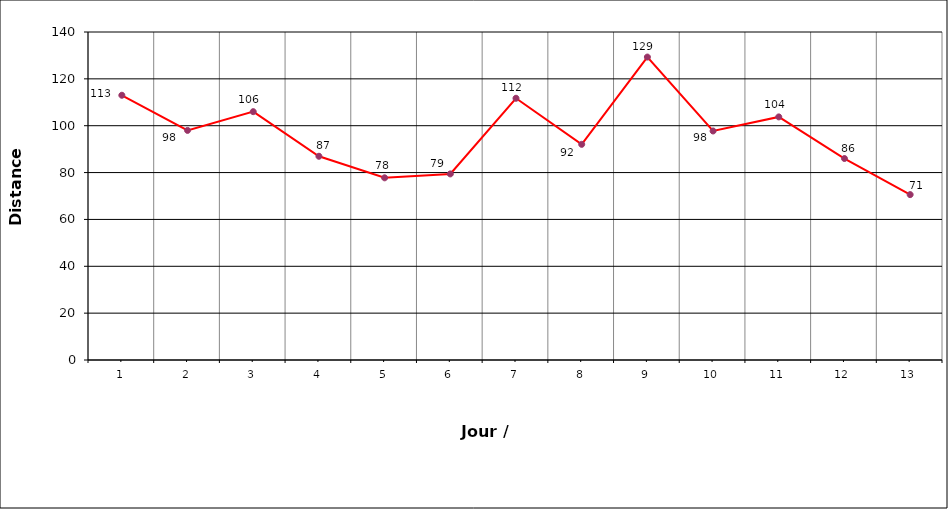
| Category | Series 1 |
|---|---|
| 0 | 113 |
| 1 | 98 |
| 2 | 106 |
| 3 | 86.96 |
| 4 | 77.76 |
| 5 | 79.43 |
| 6 | 111.72 |
| 7 | 92.05 |
| 8 | 129.3 |
| 9 | 97.75 |
| 10 | 103.76 |
| 11 | 86 |
| 12 | 70.59 |